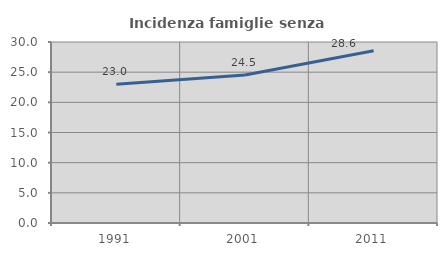
| Category | Incidenza famiglie senza nuclei |
|---|---|
| 1991.0 | 22.987 |
| 2001.0 | 24.537 |
| 2011.0 | 28.554 |